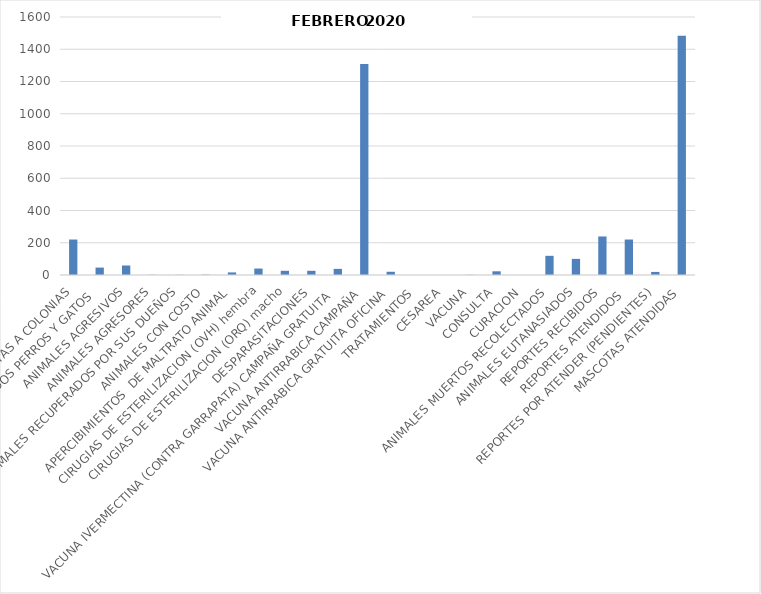
| Category | Series 0 |
|---|---|
| VISITAS A COLONIAS | 220 |
| ANIMALES CAPTURADOS PERROS Y GATOS  | 46 |
| ANIMALES AGRESIVOS | 59 |
| ANIMALES AGRESORES | 1 |
| ANIMALES RECUPERADOS POR SUS DUEÑOS | 1 |
| ANIMALES CON COSTO | 2 |
| APERCIBIMIENTOS  DE MALTRATO ANIMAL | 16 |
| CIRUGIAS DE ESTERILIZACION (OVH) hembra | 40 |
| CIRUGIAS DE ESTERILIZACION (ORQ) macho | 26 |
| DESPARASITACIONES | 26 |
| VACUNA IVERMECTINA (CONTRA GARRAPATA) CAMPAÑA GRATUITA | 38 |
| VACUNA ANTIRRABICA CAMPAÑA | 1309 |
| VACUNA ANTIRRABICA GRATUITA OFICINA | 20 |
| TRATAMIENTOS | 0 |
| CESAREA | 0 |
| VACUNA | 1 |
| CONSULTA | 23 |
| CURACION | 0 |
| ANIMALES MUERTOS RECOLECTADOS | 119 |
| ANIMALES EUTANASIADOS | 100 |
| REPORTES RECIBIDOS | 239 |
| REPORTES ATENDIDOS  | 220 |
| REPORTES POR ATENDER (PENDIENTES) | 19 |
| MASCOTAS ATENDIDAS | 1483 |